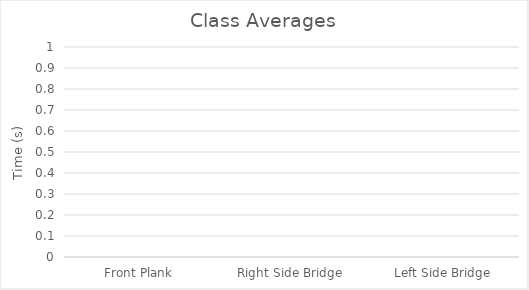
| Category | Class Averages |
|---|---|
| Front Plank | 0 |
| Right Side Bridge | 0 |
| Left Side Bridge | 0 |